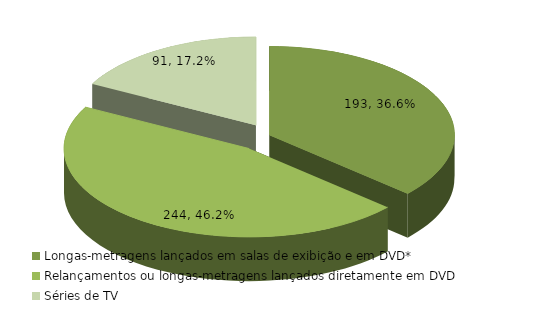
| Category | Series 0 |
|---|---|
| Longas-metragens lançados em salas de exibição e em DVD* | 193 |
| Relançamentos ou longas-metragens lançados diretamente em DVD | 244 |
| Séries de TV | 91 |